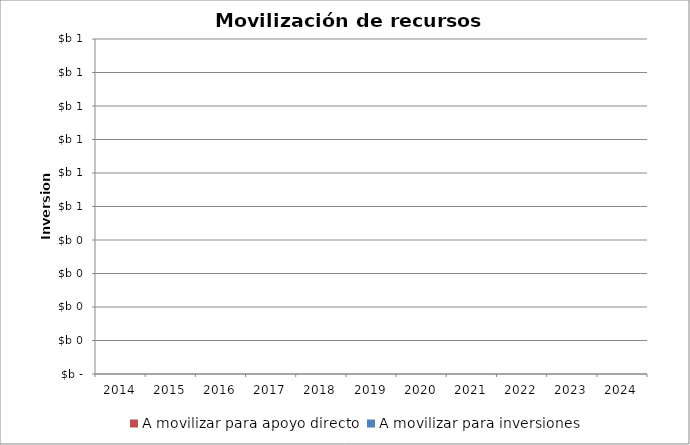
| Category | A movilizar para apoyo directo | A movilizar para inversiones |
|---|---|---|
| 2014.0 | 0 | 0 |
| 2015.0 | 0 | 0 |
| 2016.0 | 0 | 0 |
| 2017.0 | 0 | 0 |
| 2018.0 | 0 | 0 |
| 2019.0 | 0 | 0 |
| 2020.0 | 0 | 0 |
| 2021.0 | 0 | 0 |
| 2022.0 | 0 | 0 |
| 2023.0 | 0 | 0 |
| 2024.0 | 0 | 0 |